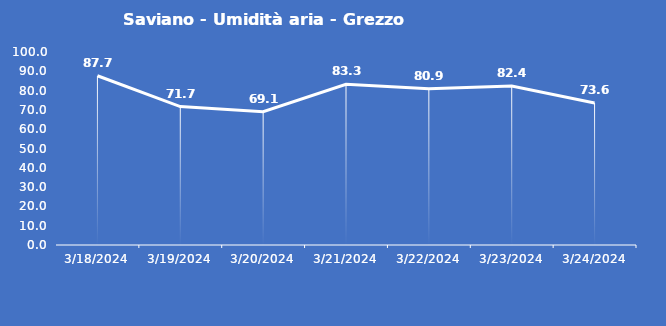
| Category | Saviano - Umidità aria - Grezzo (%) |
|---|---|
| 3/18/24 | 87.7 |
| 3/19/24 | 71.7 |
| 3/20/24 | 69.1 |
| 3/21/24 | 83.3 |
| 3/22/24 | 80.9 |
| 3/23/24 | 82.4 |
| 3/24/24 | 73.6 |